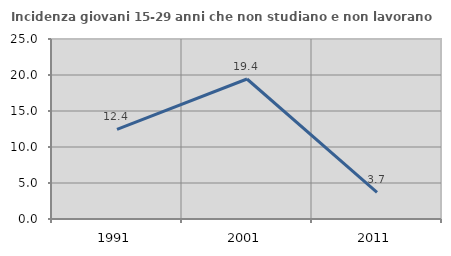
| Category | Incidenza giovani 15-29 anni che non studiano e non lavorano  |
|---|---|
| 1991.0 | 12.437 |
| 2001.0 | 19.444 |
| 2011.0 | 3.704 |